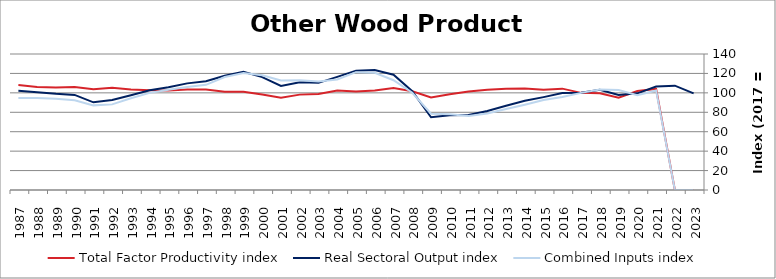
| Category | Total Factor Productivity index | Real Sectoral Output index | Combined Inputs index |
|---|---|---|---|
| 2023.0 | 0 | 99.504 | 0 |
| 2022.0 | 0 | 107.392 | 0 |
| 2021.0 | 104.09 | 106.531 | 102.345 |
| 2020.0 | 101.959 | 99.498 | 97.586 |
| 2019.0 | 95.069 | 97.888 | 102.965 |
| 2018.0 | 99.558 | 103.096 | 103.555 |
| 2017.0 | 100 | 100 | 100 |
| 2016.0 | 104.345 | 99.871 | 95.713 |
| 2015.0 | 103.295 | 95.612 | 92.562 |
| 2014.0 | 104.501 | 91.788 | 87.834 |
| 2013.0 | 104.213 | 86.803 | 83.294 |
| 2012.0 | 103.309 | 81.366 | 78.759 |
| 2011.0 | 101.281 | 77.205 | 76.228 |
| 2010.0 | 98.51 | 76.865 | 78.027 |
| 2009.0 | 95.261 | 74.836 | 78.559 |
| 2008.0 | 101.587 | 101.654 | 100.066 |
| 2007.0 | 104.962 | 118.634 | 113.026 |
| 2006.0 | 102.391 | 123.523 | 120.638 |
| 2005.0 | 101.295 | 122.848 | 121.278 |
| 2004.0 | 102.318 | 116.444 | 113.806 |
| 2003.0 | 98.807 | 110.319 | 111.65 |
| 2002.0 | 98.182 | 110.942 | 112.996 |
| 2001.0 | 95.091 | 107.196 | 112.73 |
| 2000.0 | 98.365 | 116.186 | 118.118 |
| 1999.0 | 101.206 | 121.781 | 120.33 |
| 1998.0 | 101.032 | 117.549 | 116.348 |
| 1997.0 | 103.373 | 111.944 | 108.291 |
| 1996.0 | 103.546 | 109.766 | 106.007 |
| 1995.0 | 102.347 | 105.687 | 103.263 |
| 1994.0 | 102.621 | 102.616 | 99.996 |
| 1993.0 | 103.426 | 97.603 | 94.37 |
| 1992.0 | 105.232 | 92.747 | 88.136 |
| 1991.0 | 103.601 | 90.256 | 87.119 |
| 1990.0 | 105.963 | 97.915 | 92.404 |
| 1989.0 | 105.466 | 98.987 | 93.857 |
| 1988.0 | 106.154 | 100.543 | 94.714 |
| 1987.0 | 108.074 | 102.218 | 94.581 |